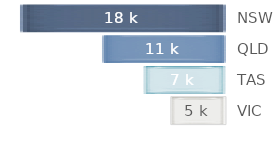
| Category | Series 0 |
|---|---|
| NSW | 18.225 |
| QLD | 10.935 |
| TAS | 7.29 |
| VIC | 4.86 |